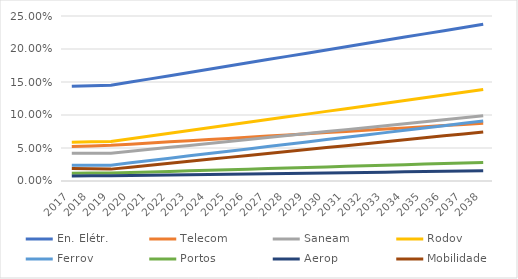
| Category | En. Elétr. | Telecom | Saneam | Rodov | Ferrov | Portos | Aerop | Mobilidade |
|---|---|---|---|---|---|---|---|---|
| 2017.0 | 0.143 | 0.052 | 0.042 | 0.059 | 0.024 | 0.012 | 0.008 | 0.019 |
| 2018.0 | 0.144 | 0.053 | 0.042 | 0.059 | 0.024 | 0.012 | 0.008 | 0.018 |
| 2019.0 | 0.145 | 0.054 | 0.042 | 0.06 | 0.024 | 0.012 | 0.008 | 0.018 |
| 2020.0 | 0.15 | 0.056 | 0.045 | 0.064 | 0.028 | 0.013 | 0.008 | 0.021 |
| 2021.0 | 0.155 | 0.058 | 0.048 | 0.068 | 0.031 | 0.014 | 0.009 | 0.024 |
| 2022.0 | 0.16 | 0.059 | 0.051 | 0.072 | 0.035 | 0.015 | 0.009 | 0.027 |
| 2023.0 | 0.164 | 0.061 | 0.054 | 0.077 | 0.038 | 0.015 | 0.01 | 0.03 |
| 2024.0 | 0.169 | 0.063 | 0.057 | 0.081 | 0.042 | 0.016 | 0.01 | 0.033 |
| 2025.0 | 0.174 | 0.065 | 0.06 | 0.085 | 0.045 | 0.017 | 0.01 | 0.036 |
| 2026.0 | 0.179 | 0.066 | 0.063 | 0.089 | 0.049 | 0.018 | 0.011 | 0.039 |
| 2027.0 | 0.184 | 0.068 | 0.066 | 0.093 | 0.052 | 0.019 | 0.011 | 0.042 |
| 2028.0 | 0.189 | 0.07 | 0.069 | 0.097 | 0.056 | 0.02 | 0.011 | 0.045 |
| 2029.0 | 0.194 | 0.072 | 0.072 | 0.101 | 0.059 | 0.021 | 0.012 | 0.048 |
| 2030.0 | 0.199 | 0.073 | 0.075 | 0.105 | 0.063 | 0.021 | 0.012 | 0.051 |
| 2031.0 | 0.203 | 0.075 | 0.078 | 0.11 | 0.066 | 0.022 | 0.013 | 0.054 |
| 2032.0 | 0.208 | 0.077 | 0.081 | 0.114 | 0.07 | 0.023 | 0.013 | 0.057 |
| 2033.0 | 0.213 | 0.079 | 0.084 | 0.118 | 0.073 | 0.024 | 0.013 | 0.06 |
| 2034.0 | 0.218 | 0.08 | 0.087 | 0.122 | 0.077 | 0.025 | 0.014 | 0.062 |
| 2035.0 | 0.223 | 0.082 | 0.09 | 0.126 | 0.08 | 0.026 | 0.014 | 0.065 |
| 2036.0 | 0.228 | 0.084 | 0.093 | 0.13 | 0.084 | 0.026 | 0.015 | 0.068 |
| 2037.0 | 0.233 | 0.086 | 0.096 | 0.134 | 0.087 | 0.027 | 0.015 | 0.071 |
| 2038.0 | 0.238 | 0.088 | 0.099 | 0.139 | 0.091 | 0.028 | 0.015 | 0.074 |